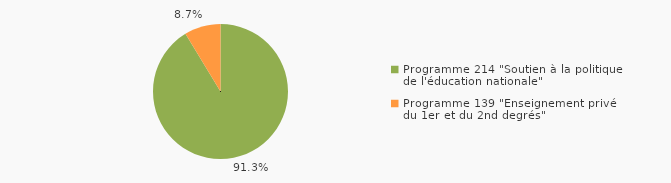
| Category | Figure 10.1 - Répartition des dépenses d'action sociale en 2015 par programme LOLF (214 et 139) |
|---|---|
| Programme 214 "Soutien à la politique de l'éducation nationale" | 0.913 |
| Programme 139 "Enseignement privé du 1er et du 2nd degrés" | 0.087 |